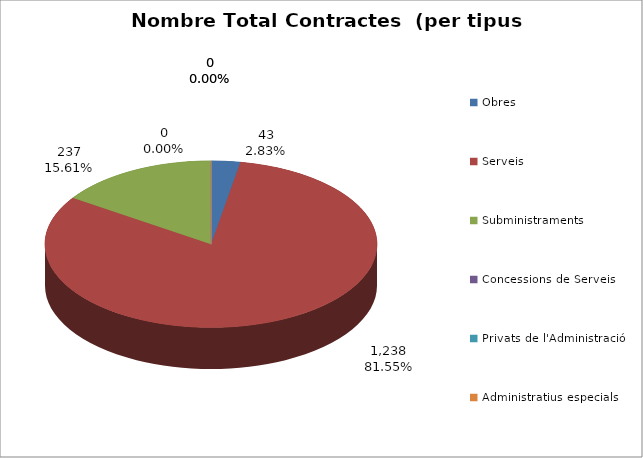
| Category | Nombre Total Contractes |
|---|---|
| Obres | 43 |
| Serveis | 1238 |
| Subministraments | 237 |
| Concessions de Serveis | 0 |
| Privats de l'Administració | 0 |
| Administratius especials | 0 |